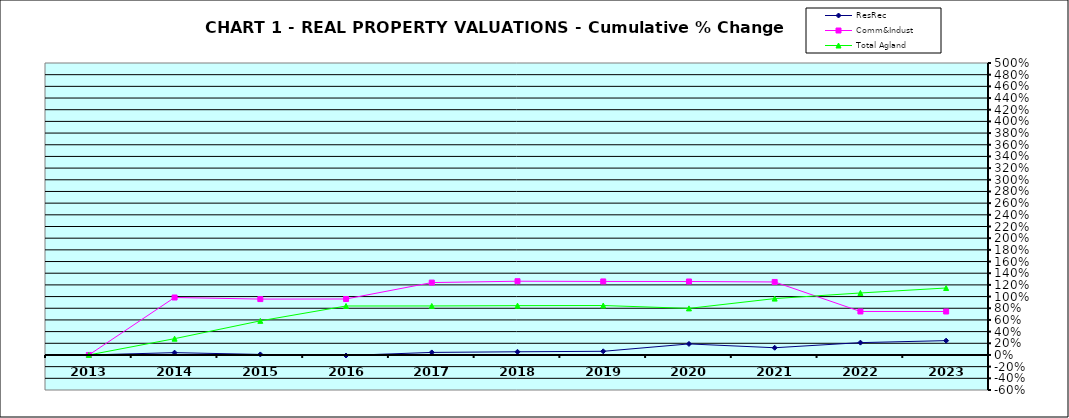
| Category | ResRec | Comm&Indust | Total Agland |
|---|---|---|---|
| 2013.0 | 0 | 0 | 0 |
| 2014.0 | 0.04 | 0.984 | 0.279 |
| 2015.0 | 0.009 | 0.957 | 0.584 |
| 2016.0 | -0.009 | 0.959 | 0.839 |
| 2017.0 | 0.044 | 1.239 | 0.839 |
| 2018.0 | 0.055 | 1.263 | 0.845 |
| 2019.0 | 0.063 | 1.259 | 0.847 |
| 2020.0 | 0.189 | 1.258 | 0.798 |
| 2021.0 | 0.124 | 1.25 | 0.966 |
| 2022.0 | 0.211 | 0.745 | 1.062 |
| 2023.0 | 0.245 | 0.744 | 1.147 |